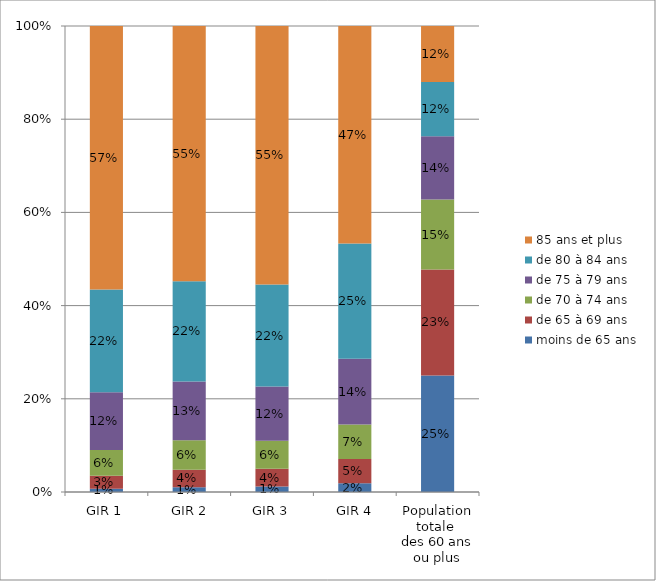
| Category | moins de 65 ans | de 65 à 69 ans | de 70 à 74 ans  | de 75 à 79 ans | de 80 à 84 ans | 85 ans et plus |
|---|---|---|---|---|---|---|
| GIR 1 | 0.007 | 0.028 | 0.055 | 0.124 | 0.22 | 0.565 |
|  GIR 2 | 0.01 | 0.038 | 0.063 | 0.126 | 0.215 | 0.548 |
| GIR 3 | 0.012 | 0.038 | 0.06 | 0.116 | 0.219 | 0.554 |
|  GIR 4 | 0.019 | 0.052 | 0.074 | 0.141 | 0.248 | 0.467 |
| Population totale 
des 60 ans ou plus | 0.25 | 0.227 | 0.15 | 0.136 | 0.116 | 0.12 |